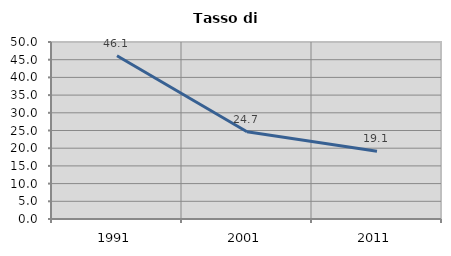
| Category | Tasso di disoccupazione   |
|---|---|
| 1991.0 | 46.132 |
| 2001.0 | 24.65 |
| 2011.0 | 19.142 |